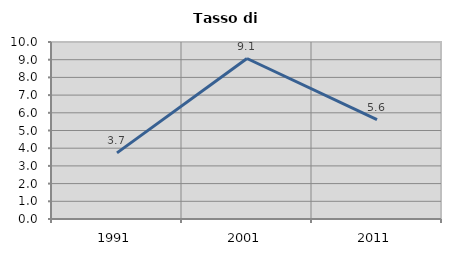
| Category | Tasso di disoccupazione   |
|---|---|
| 1991.0 | 3.736 |
| 2001.0 | 9.067 |
| 2011.0 | 5.61 |